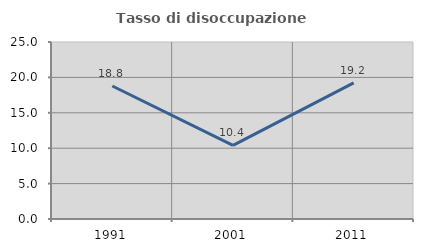
| Category | Tasso di disoccupazione giovanile  |
|---|---|
| 1991.0 | 18.788 |
| 2001.0 | 10.409 |
| 2011.0 | 19.231 |